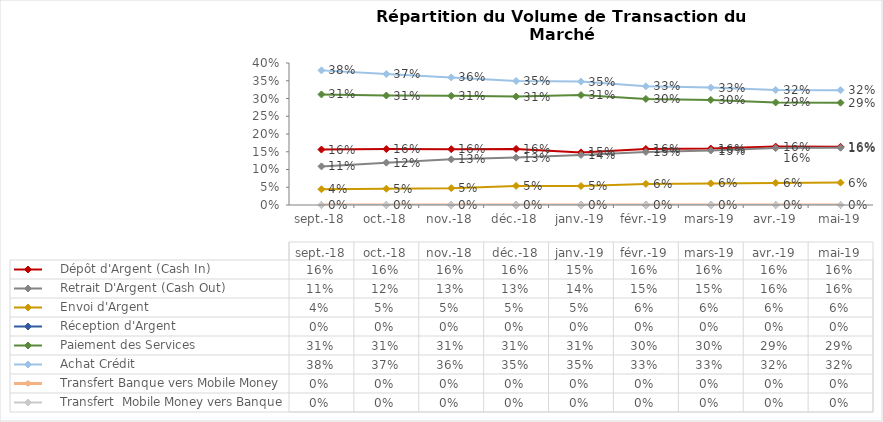
| Category |     Dépôt d'Argent (Cash In) |     Retrait D'Argent (Cash Out)  |     Envoi d'Argent  |     Réception d'Argent |     Paiement des Services |     Achat Crédit |     Transfert Banque vers Mobile Money |     Transfert  Mobile Money vers Banque  |
|---|---|---|---|---|---|---|---|---|
| 2018-09-01 | 0.156 | 0.109 | 0.044 | 0 | 0.311 | 0.379 | 0 | 0 |
| 2018-10-01 | 0.158 | 0.119 | 0.046 | 0 | 0.308 | 0.369 | 0 | 0 |
| 2018-11-01 | 0.157 | 0.129 | 0.047 | 0 | 0.307 | 0.359 | 0 | 0 |
| 2018-12-01 | 0.158 | 0.133 | 0.054 | 0 | 0.305 | 0.349 | 0 | 0 |
| 2019-01-01 | 0.148 | 0.141 | 0.054 | 0 | 0.31 | 0.348 | 0 | 0 |
| 2019-02-01 | 0.158 | 0.15 | 0.059 | 0 | 0.299 | 0.334 | 0 | 0 |
| 2019-03-01 | 0.159 | 0.153 | 0.061 | 0 | 0.296 | 0.331 | 0 | 0 |
| 2019-04-01 | 0.164 | 0.16 | 0.062 | 0 | 0.289 | 0.324 | 0 | 0 |
| 2019-05-01 | 0.164 | 0.161 | 0.063 | 0 | 0.288 | 0.323 | 0 | 0 |